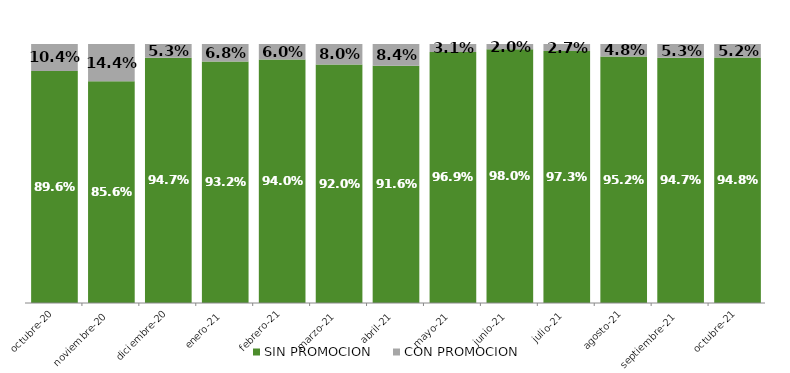
| Category | SIN PROMOCION   | CON PROMOCION   |
|---|---|---|
| 2020-10-01 | 0.896 | 0.104 |
| 2020-11-01 | 0.856 | 0.144 |
| 2020-12-01 | 0.947 | 0.053 |
| 2021-01-01 | 0.932 | 0.068 |
| 2021-02-01 | 0.94 | 0.06 |
| 2021-03-01 | 0.92 | 0.08 |
| 2021-04-01 | 0.916 | 0.084 |
| 2021-05-01 | 0.969 | 0.031 |
| 2021-06-01 | 0.98 | 0.02 |
| 2021-07-01 | 0.973 | 0.027 |
| 2021-08-01 | 0.952 | 0.048 |
| 2021-09-01 | 0.947 | 0.053 |
| 2021-10-01 | 0.948 | 0.052 |